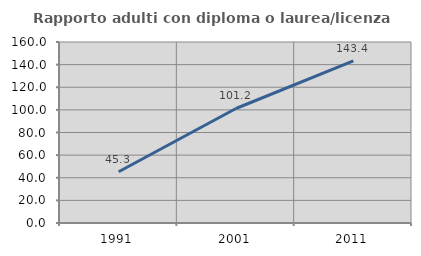
| Category | Rapporto adulti con diploma o laurea/licenza media  |
|---|---|
| 1991.0 | 45.333 |
| 2001.0 | 101.22 |
| 2011.0 | 143.373 |